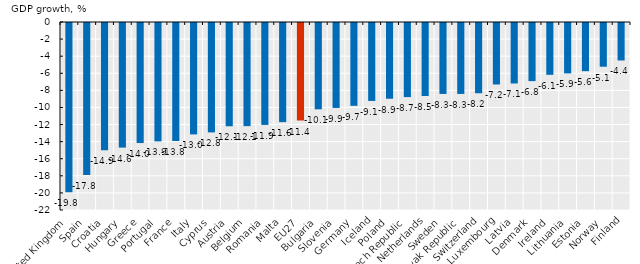
| Category | GDP growth |
|---|---|
| United Kingdom | -19.811 |
| Spain | -17.792 |
| Croatia | -14.9 |
| Hungary | -14.583 |
| Greece | -14.048 |
| Portugal | -13.856 |
| France | -13.812 |
| Italy | -13.036 |
| Cyprus | -12.8 |
| Austria | -12.086 |
| Belgium | -12.069 |
| Romania | -11.927 |
| Malta | -11.6 |
| EU27 | -11.417 |
| Bulgaria | -10.1 |
| Slovenia | -9.942 |
| Germany | -9.691 |
| Iceland | -9.12 |
| Poland | -8.861 |
| Czech Republic | -8.67 |
| Netherlands | -8.542 |
| Sweden | -8.302 |
| Slovak Republic | -8.302 |
| Switzerland | -8.222 |
| Luxembourg | -7.193 |
| Latvia | -7.077 |
| Denmark | -6.8 |
| Ireland | -6.063 |
| Lithuania | -5.9 |
| Estonia | -5.636 |
| Norway | -5.117 |
| Finland | -4.383 |